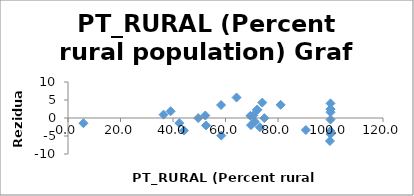
| Category | Series 0 |
|---|---|
| 74.8 | -0.043 |
| 100.0 | -4.463 |
| 69.7 | -1.976 |
| 100.0 | -0.43 |
| 74.0 | 4.28 |
| 73.1 | -2.563 |
| 52.3 | 0.698 |
| 49.6 | -0.018 |
| 71.2 | -1.041 |
| 70.6 | 0.704 |
| 64.2 | 5.697 |
| 58.3 | 3.612 |
| 100.0 | 4.051 |
| 72.0 | 2.202 |
| 100.0 | 2.49 |
| 100.0 | 1.611 |
| 69.5 | 0.608 |
| 81.0 | 3.654 |
| 39.1 | 1.87 |
| 58.4 | -4.885 |
| 42.4 | -1.406 |
| 36.4 | 0.927 |
| 99.8 | -6.394 |
| 90.6 | -3.336 |
| 5.9 | -1.458 |
| 44.2 | -3.493 |
| 100.0 | 2.445 |
| 52.6 | -2.068 |
| 100.0 | -3.622 |
| 72.1 | 2.347 |